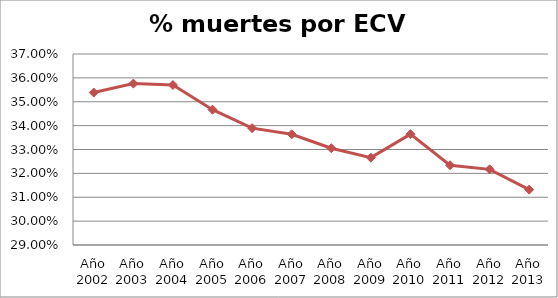
| Category | Series 0 |
|---|---|
| Año 2002 | 0.354 |
| Año 2003 | 0.358 |
| Año 2004 | 0.357 |
| Año 2005 | 0.347 |
| Año 2006 | 0.339 |
| Año 2007 | 0.336 |
| Año 2008 | 0.331 |
| Año 2009 | 0.327 |
| Año 2010 | 0.336 |
| Año 2011 | 0.323 |
| Año 2012 | 0.322 |
| Año 2013 | 0.313 |